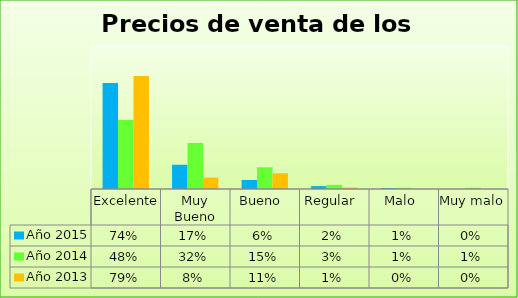
| Category | Año 2015 | Año 2014 | Año 2013 |
|---|---|---|---|
| Excelente | 0.741 | 0.482 | 0.79 |
| Muy Bueno | 0.17 | 0.322 | 0.08 |
| Bueno  | 0.063 | 0.152 | 0.11 |
| Regular  | 0.02 | 0.029 | 0.01 |
| Malo  | 0.006 | 0.008 | 0 |
| Muy malo  | 0 | 0.008 | 0 |